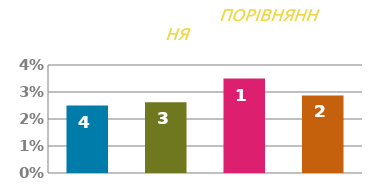
| Category | СТАВКА |
|---|---|
| 0 | 0.025 |
| 1 | 0.026 |
| 2 | 0.035 |
| 3 | 0.029 |